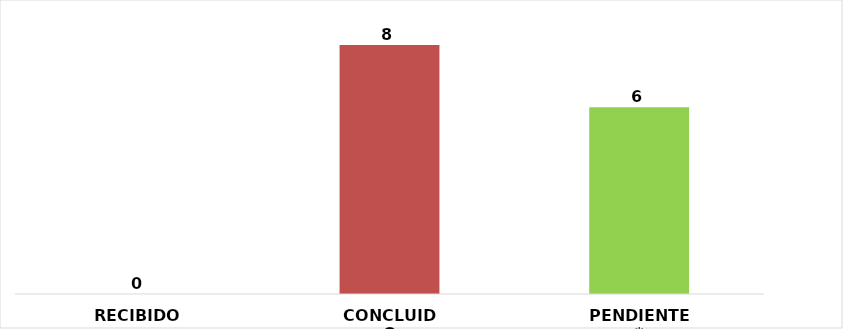
| Category | RECIBIDO |
|---|---|
| RECIBIDO | 0 |
| CONCLUIDO | 8 |
| PENDIENTE* | 6 |